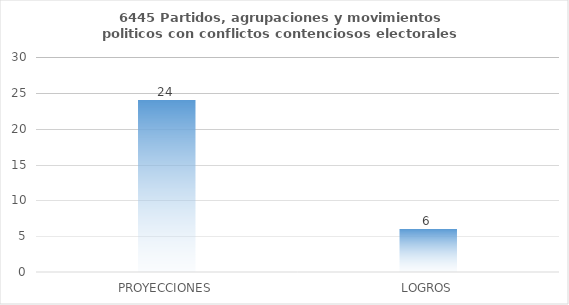
| Category | 6445 |
|---|---|
| PROYECCIONES | 24 |
| LOGROS | 6 |